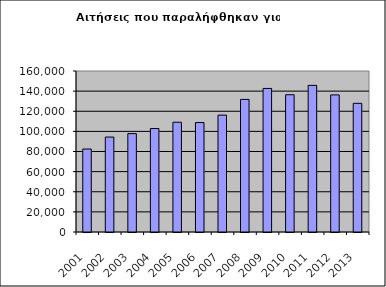
| Category | Series 0 |
|---|---|
| 2001.0 | 82454 |
| 2002.0 | 94358 |
| 2003.0 | 97793 |
| 2004.0 | 102813 |
| 2005.0 | 109089 |
| 2006.0 | 108785 |
| 2007.0 | 116159 |
| 2008.0 | 131779 |
| 2009.0 | 142663 |
| 2010.0 | 136417 |
| 2011.0 | 145734 |
| 2012.0 | 136250 |
| 2013.0 | 127875 |